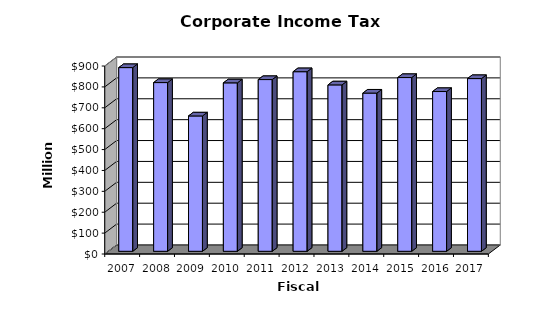
| Category | Amount |
|---|---|
| 2007.0 | 879575371 |
| 2008.0 | 807851584 |
| 2009.0 | 648032537 |
| 2010.0 | 806472760 |
| 2011.0 | 822258802.84 |
| 2012.0 | 859922839.55 |
| 2013.0 | 796728154.4 |
| 2014.0 | 757490742.09 |
| 2015.0 | 831906887.16 |
| 2016.0 | 764948013.77 |
| 2017.0 | 826960822.31 |